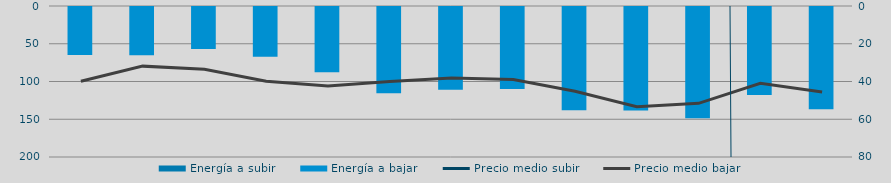
| Category | Energía a subir | Energía a bajar |
|---|---|---|
| D |  | 65058.027 |
| E |  | 65080.662 |
| F |  | 56832.525 |
| M |  | 67245.511 |
| A |  | 87837.741 |
| M |  | 115472.265 |
| J |  | 110945.08 |
| J |  | 109933.033 |
| A |  | 138127.981 |
| S |  | 138345.883 |
| O |  | 148810.416 |
| N |  | 118042.065 |
| D |  | 136637.182 |